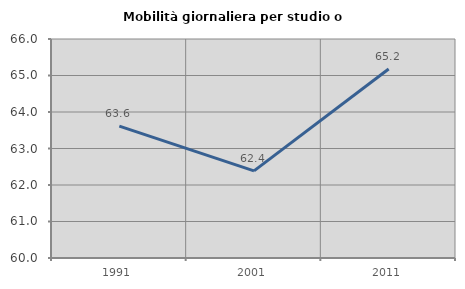
| Category | Mobilità giornaliera per studio o lavoro |
|---|---|
| 1991.0 | 63.615 |
| 2001.0 | 62.386 |
| 2011.0 | 65.178 |